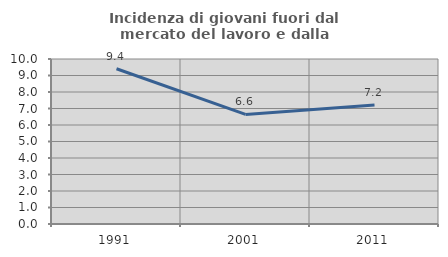
| Category | Incidenza di giovani fuori dal mercato del lavoro e dalla formazione  |
|---|---|
| 1991.0 | 9.408 |
| 2001.0 | 6.639 |
| 2011.0 | 7.207 |